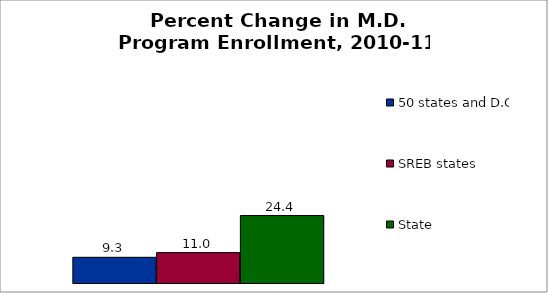
| Category | 50 states and D.C. | SREB states | State |
|---|---|---|---|
| 0 | 9.304 | 11.001 | 24.422 |